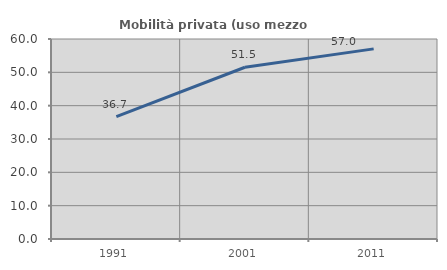
| Category | Mobilità privata (uso mezzo privato) |
|---|---|
| 1991.0 | 36.714 |
| 2001.0 | 51.52 |
| 2011.0 | 57.037 |